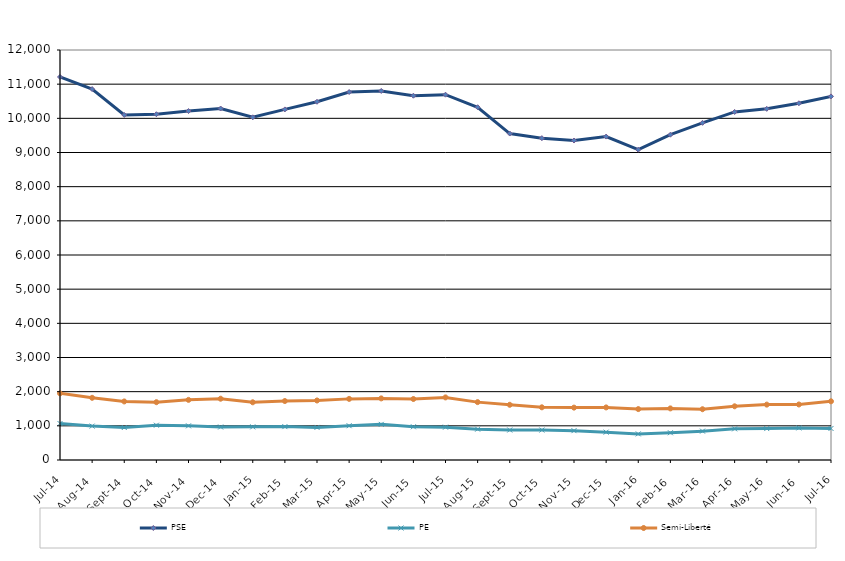
| Category | PSE | PE | Semi-Liberté |
|---|---|---|---|
| 2014-07-01 | 11210 | 1068 | 1951 |
| 2014-08-01 | 10856 | 992 | 1820 |
| 2014-09-01 | 10098 | 951 | 1714 |
| 2014-10-01 | 10120 | 1018 | 1692 |
| 2014-11-01 | 10213 | 1000 | 1760 |
| 2014-12-01 | 10287 | 966 | 1794 |
| 2015-01-01 | 10030 | 970 | 1689 |
| 2015-02-01 | 10261 | 977 | 1726 |
| 2015-03-01 | 10485 | 954 | 1742 |
| 2015-04-01 | 10770 | 1003 | 1789 |
| 2015-05-01 | 10801 | 1043 | 1803 |
| 2015-06-01 | 10662 | 973 | 1785 |
| 2015-07-01 | 10692 | 961 | 1832 |
| 2015-08-01 | 10325 | 903 | 1694 |
| 2015-09-01 | 9555 | 878 | 1616 |
| 2015-10-01 | 9420 | 877 | 1542 |
| 2015-11-01 | 9350 | 859 | 1533 |
| 2015-12-01 | 9466 | 815 | 1539 |
| 2016-01-01 | 9081 | 764 | 1490 |
| 2016-02-01 | 9521 | 798 | 1510 |
| 2016-03-01 | 9868 | 845 | 1486 |
| 2016-04-01 | 10187 | 912 | 1572 |
| 2016-05-01 | 10278 | 920 | 1621 |
| 2016-06-01 | 10441 | 939 | 1625 |
| 2016-07-01 | 10642 | 923 | 1718 |